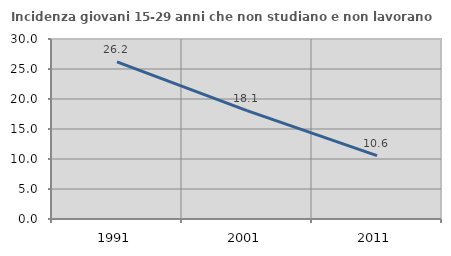
| Category | Incidenza giovani 15-29 anni che non studiano e non lavorano  |
|---|---|
| 1991.0 | 26.19 |
| 2001.0 | 18.065 |
| 2011.0 | 10.563 |